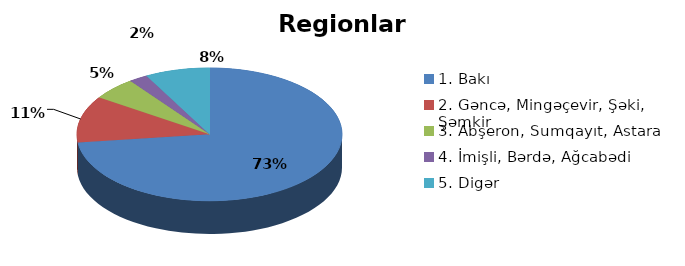
| Category | Series 0 |
|---|---|
| 1. Bakı | 0.731 |
| 2. Gəncə, Mingəçevir, Şəki, Şəmkir | 0.113 |
| 3. Abşeron, Sumqayıt, Astara | 0.054 |
| 4. İmişli, Bərdə, Ağcabədi | 0.023 |
| 5. Digər | 0.079 |